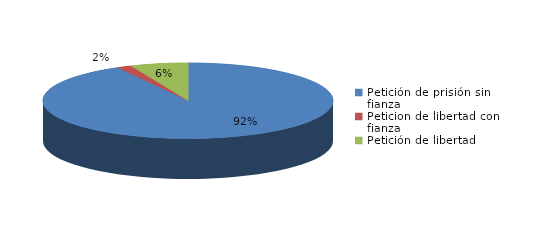
| Category | Series 0 |
|---|---|
| Petición de prisión sin fianza | 114 |
| Peticion de libertad con fianza | 2 |
| Petición de libertad | 8 |